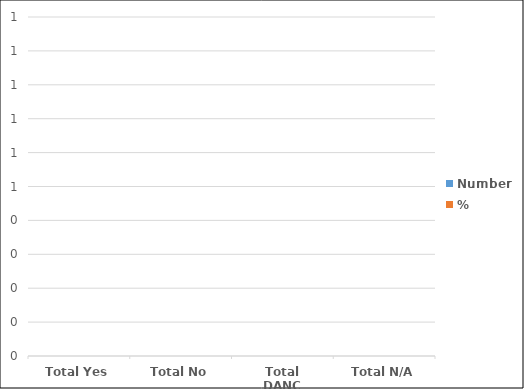
| Category | Number | % |
|---|---|---|
| Total Yes | 0 | 0 |
| Total No | 0 | 0 |
| Total DANC | 0 | 0 |
| Total N/A | 0 | 0 |